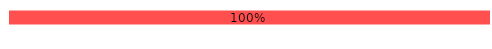
| Category | Oui | Non |
|---|---|---|
| Complétude N1 | 0 | 1 |